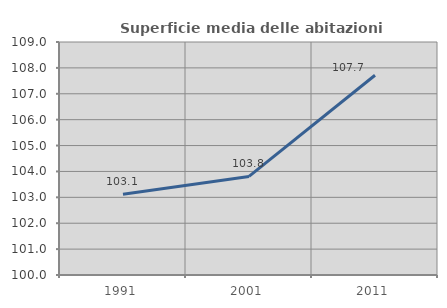
| Category | Superficie media delle abitazioni occupate |
|---|---|
| 1991.0 | 103.122 |
| 2001.0 | 103.807 |
| 2011.0 | 107.717 |